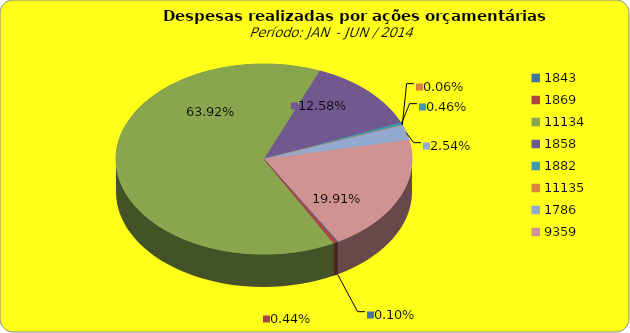
| Category | Series 1 |
|---|---|
| 1843.0 | 100000 |
| 1869.0 | 446187.37 |
| 11134.0 | 64133629.67 |
| 1858.0 | 12618960.67 |
| 1882.0 | 460659.2 |
| 11135.0 | 57798.17 |
| 1786.0 | 2544700.2 |
| 9359.0 | 19973182.28 |